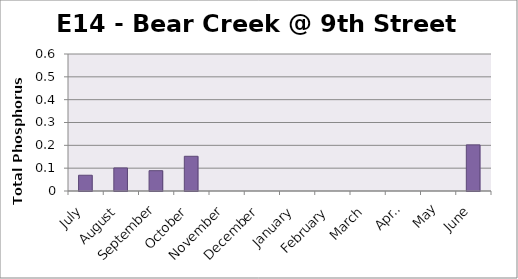
| Category | Phosphorus (mg/L) |
|---|---|
| July | 0.069 |
| August | 0.101 |
| September | 0.089 |
| October | 0.152 |
| November | 0 |
| December | 0 |
| January | 0 |
| February | 0 |
| March | 0 |
| April | 0 |
| May | 0 |
| June | 0.202 |